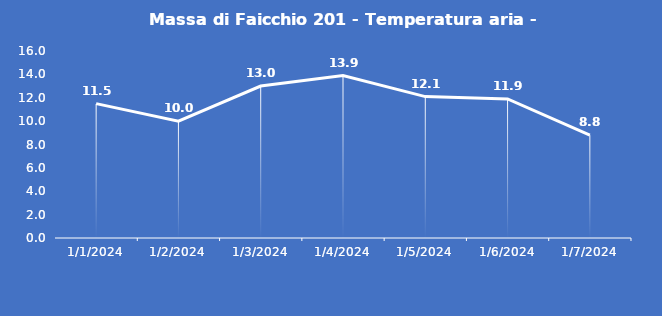
| Category | Massa di Faicchio 201 - Temperatura aria - Grezzo (°C) |
|---|---|
| 1/1/24 | 11.5 |
| 1/2/24 | 10 |
| 1/3/24 | 13 |
| 1/4/24 | 13.9 |
| 1/5/24 | 12.1 |
| 1/6/24 | 11.9 |
| 1/7/24 | 8.8 |